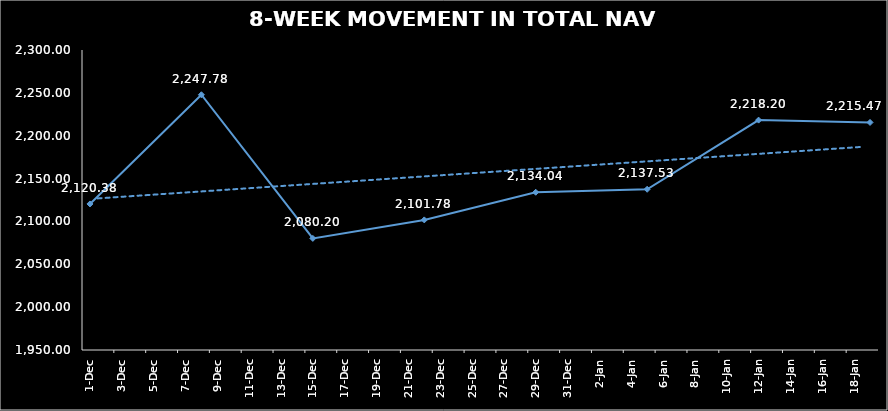
| Category | TOTAL NAV |
|---|---|
| 2023-12-01 | 2120.382 |
| 2023-12-08 | 2247.78 |
| 2023-12-15 | 2080.204 |
| 2023-12-22 | 2101.782 |
| 2023-12-29 | 2134.045 |
| 2024-01-05 | 2137.525 |
| 2024-01-12 | 2218.205 |
| 2024-01-19 | 2215.471 |